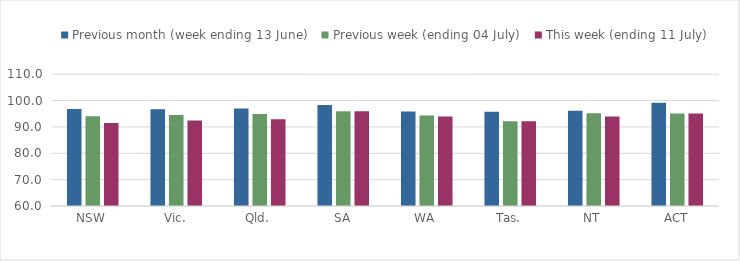
| Category | Previous month (week ending 13 June) | Previous week (ending 04 July) | This week (ending 11 July) |
|---|---|---|---|
| NSW | 96.767 | 94.012 | 91.457 |
| Vic. | 96.679 | 94.473 | 92.468 |
| Qld. | 97.01 | 94.907 | 92.876 |
| SA | 98.285 | 95.944 | 95.982 |
| WA | 95.806 | 94.367 | 93.918 |
| Tas. | 95.755 | 92.153 | 92.133 |
| NT | 96.15 | 95.224 | 93.936 |
| ACT | 99.194 | 95.085 | 95.117 |